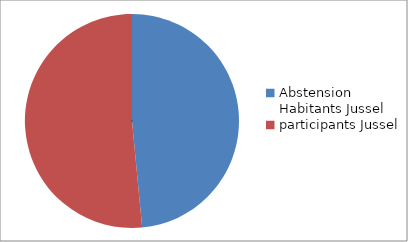
| Category | Series 0 |
|---|---|
| Abstension Habitants Jussel | 16 |
| participants Jussel | 17 |